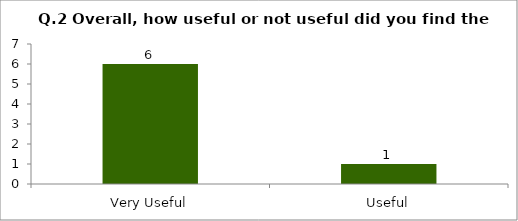
| Category | Q.2 Overall, how useful or not useful did you find the Session? |
|---|---|
| Very Useful | 6 |
| Useful | 1 |